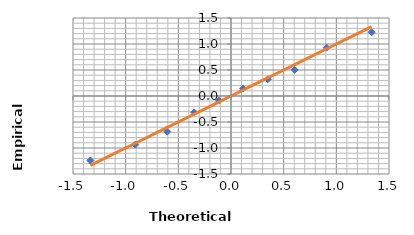
| Category | Series 0 |
|---|---|
| -1.335177736118936 | -1.24 |
| -0.9084578685373853 | -0.936 |
| -0.6045853465832371 | -0.685 |
| -0.3487556955170447 | -0.314 |
| -0.11418529432142839 | -0.09 |
| 0.11418529432142825 | 0.147 |
| 0.3487556955170447 | 0.322 |
| 0.6045853465832371 | 0.502 |
| 0.9084578685373846 | 0.93 |
| 1.335177736118936 | 1.225 |